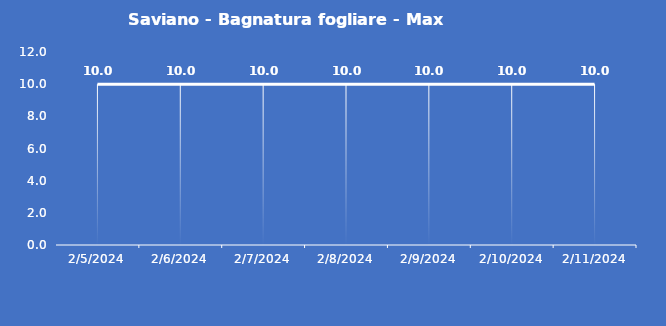
| Category | Saviano - Bagnatura fogliare - Max (min) |
|---|---|
| 2/5/24 | 10 |
| 2/6/24 | 10 |
| 2/7/24 | 10 |
| 2/8/24 | 10 |
| 2/9/24 | 10 |
| 2/10/24 | 10 |
| 2/11/24 | 10 |